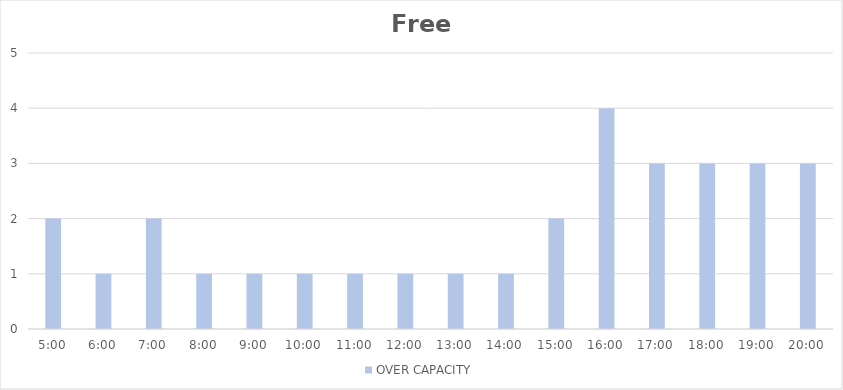
| Category | OVER CAPACITY |
|---|---|
| 0.20833333333333334 | 2 |
| 0.25 | 1 |
| 0.2916666666666667 | 2 |
| 0.3333333333333333 | 1 |
| 0.375 | 1 |
| 0.4166666666666667 | 1 |
| 0.4583333333333333 | 1 |
| 0.5 | 1 |
| 0.5416666666666666 | 1 |
| 0.5833333333333334 | 1 |
| 0.625 | 2 |
| 0.6666666666666666 | 4 |
| 0.7083333333333334 | 3 |
| 0.75 | 3 |
| 0.7916666666666666 | 3 |
| 0.8333333333333334 | 3 |